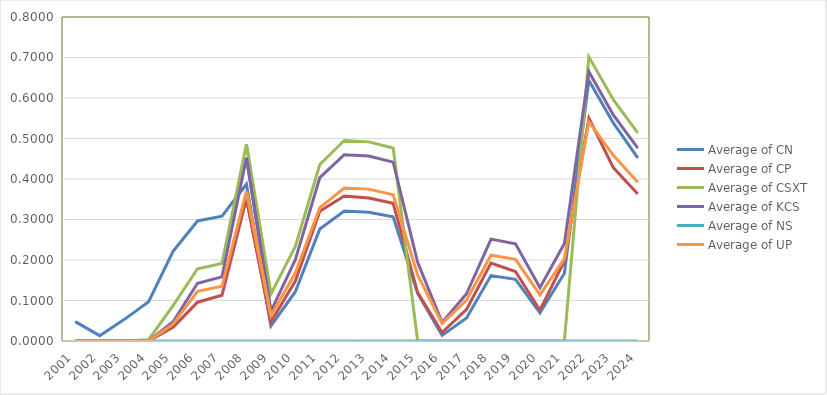
| Category | Average of CN | Average of CP | Average of CSXT | Average of KCS | Average of NS | Average of UP |
|---|---|---|---|---|---|---|
| 2001 | 0.048 | 0 | 0 | 0 | 0 | 0 |
| 2002 | 0.013 | 0 | 0 | 0 | 0 | 0 |
| 2003 | 0.053 | 0 | 0 | 0 | 0 | 0 |
| 2004 | 0.097 | 0 | 0.003 | 0 | 0 | 0 |
| 2005 | 0.222 | 0.034 | 0.088 | 0.048 | 0 | 0.042 |
| 2006 | 0.296 | 0.096 | 0.178 | 0.142 | 0 | 0.122 |
| 2007 | 0.308 | 0.113 | 0.192 | 0.158 | 0 | 0.135 |
| 2008 | 0.387 | 0.351 | 0.486 | 0.453 | 0 | 0.37 |
| 2009 | 0.037 | 0.047 | 0.116 | 0.073 | 0 | 0.062 |
| 2010 | 0.122 | 0.148 | 0.233 | 0.201 | 0 | 0.168 |
| 2011 | 0.277 | 0.321 | 0.436 | 0.403 | 0 | 0.329 |
| 2012 | 0.321 | 0.358 | 0.495 | 0.46 | 0 | 0.377 |
| 2013 | 0.318 | 0.353 | 0.492 | 0.457 | 0 | 0.375 |
| 2014 | 0.307 | 0.34 | 0.477 | 0.442 | 0 | 0.361 |
| 2015 | 0.117 | 0.119 | 0 | 0.194 | 0 | 0.163 |
| 2016 | 0.014 | 0.021 | 0 | 0.046 | 0 | 0.043 |
| 2017 | 0.057 | 0.078 | 0 | 0.117 | 0 | 0.101 |
| 2018 | 0.162 | 0.192 | 0 | 0.252 | 0 | 0.212 |
| 2019 | 0.152 | 0.172 | 0 | 0.24 | 0 | 0.202 |
| 2020 | 0.07 | 0.076 | 0 | 0.132 | 0 | 0.114 |
| 2021 | 0.167 | 0.198 | 0 | 0.241 | 0 | 0.203 |
| 2022 | 0.643 | 0.551 | 0.702 | 0.665 | 0 | 0.542 |
| 2023 | 0.538 | 0.428 | 0.596 | 0.558 | 0 | 0.458 |
| 2024 | 0.452 | 0.363 | 0.514 | 0.476 | 0 | 0.392 |